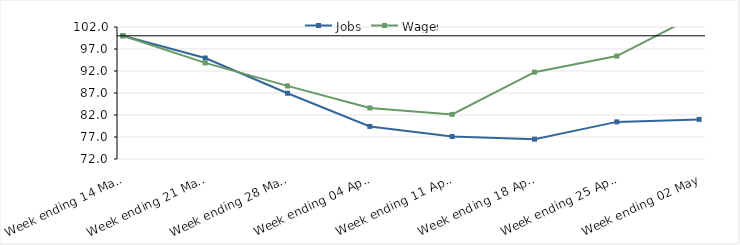
| Category | Jobs | Wages |
|---|---|---|
| 2020-03-14 | 100 | 100 |
| 2020-03-21 | 94.95 | 93.84 |
| 2020-03-28 | 86.948 | 88.615 |
| 2020-04-04 | 79.407 | 83.603 |
| 2020-04-11 | 77.12 | 82.135 |
| 2020-04-18 | 76.509 | 91.726 |
| 2020-04-25 | 80.437 | 95.394 |
| 2020-05-02 | 80.998 | 104.973 |